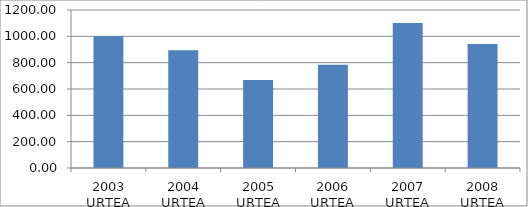
| Category | Series 0 |
|---|---|
| 2003 URTEA | 1001.2 |
| 2004 URTEA | 894.7 |
| 2005 URTEA | 668 |
| 2006 URTEA | 783.6 |
| 2007 URTEA | 1101.6 |
| 2008 URTEA | 941.7 |